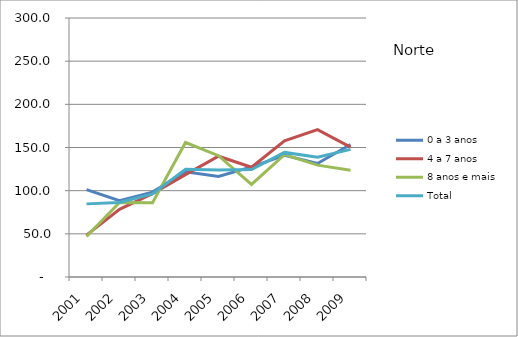
| Category | 0 a 3 anos | 4 a 7 anos | 8 anos e mais | Total |
|---|---|---|---|---|
| 2001.0 | 101.2 | 48.5 | 47 | 84.7 |
| 2002.0 | 88.4 | 78.4 | 86.3 | 86.3 |
| 2003.0 | 98.3 | 96.5 | 86.1 | 96.3 |
| 2004.0 | 121.9 | 118.6 | 155.8 | 124.8 |
| 2005.0 | 116.4 | 139.9 | 140.5 | 123.8 |
| 2006.0 | 127.6 | 127.1 | 107.2 | 124.5 |
| 2007.0 | 141 | 157.6 | 141.7 | 144.3 |
| 2008.0 | 131.5 | 170.7 | 129.6 | 138.7 |
| 2009.0 | 153.4 | 150.4 | 123.6 | 147.8 |